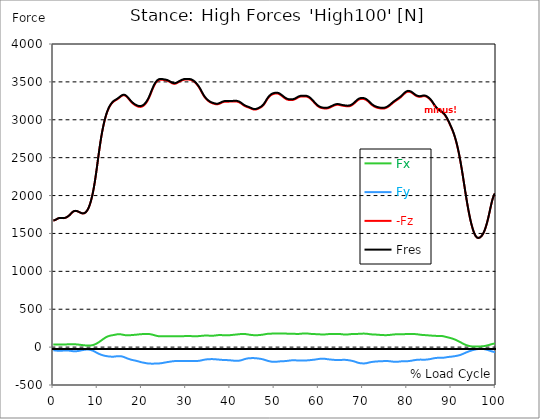
| Category |  Fx |  Fy |  -Fz |  Fres |
|---|---|---|---|---|
| 0.0 | 35.362 | -42.18 | 1669.682 | 1670.712 |
| 0.167348456675344 | 35.411 | -42.719 | 1672.134 | 1673.181 |
| 0.334696913350688 | 35.477 | -43.455 | 1675.469 | 1676.516 |
| 0.5020453700260321 | 35.591 | -44.403 | 1679.769 | 1680.848 |
| 0.669393826701376 | 35.722 | -45.515 | 1684.952 | 1686.063 |
| 0.83674228337672 | 35.853 | -46.692 | 1690.805 | 1691.949 |
| 1.0040907400520642 | 35.967 | -47.689 | 1696.118 | 1697.295 |
| 1.1621420602454444 | 36.033 | -48.294 | 1699.96 | 1701.153 |
| 1.3294905169207885 | 36.065 | -48.523 | 1702.412 | 1703.622 |
| 1.4968389735961325 | 36.033 | -48.441 | 1703.655 | 1704.848 |
| 1.6641874302714765 | 35.967 | -48.098 | 1703.916 | 1705.093 |
| 1.8315358869468206 | 35.853 | -47.575 | 1703.475 | 1704.636 |
| 1.9988843436221646 | 35.706 | -46.905 | 1702.641 | 1703.785 |
| 2.1662328002975086 | 35.575 | -46.185 | 1701.971 | 1703.099 |
| 2.333581256972853 | 35.493 | -45.482 | 1701.987 | 1703.115 |
| 2.5009297136481967 | 35.509 | -44.845 | 1703.017 | 1704.129 |
| 2.6682781703235405 | 35.608 | -44.321 | 1705.224 | 1706.32 |
| 2.8356266269988843 | 35.771 | -44.011 | 1708.674 | 1709.769 |
| 3.002975083674229 | 36.033 | -43.994 | 1713.284 | 1714.379 |
| 3.1703235403495724 | 36.376 | -44.354 | 1718.957 | 1720.085 |
| 3.337671997024917 | 36.752 | -45.024 | 1725.595 | 1726.723 |
| 3.4957233172182973 | 37.128 | -45.956 | 1733.181 | 1734.341 |
| 3.663071773893641 | 37.488 | -47.133 | 1741.78 | 1742.973 |
| 3.8304202305689854 | 37.847 | -48.507 | 1751.458 | 1752.685 |
| 3.997768687244329 | 38.223 | -50.044 | 1762.052 | 1763.328 |
| 4.165117143919673 | 38.469 | -51.564 | 1772.45 | 1773.774 |
| 4.332465600595017 | 38.518 | -52.872 | 1781.589 | 1782.946 |
| 4.499814057270361 | 38.371 | -53.853 | 1788.635 | 1790.009 |
| 4.667162513945706 | 38.027 | -54.441 | 1793.475 | 1794.864 |
| 4.834510970621049 | 37.504 | -54.67 | 1796.221 | 1797.611 |
| 5.001859427296393 | 36.817 | -54.523 | 1797.055 | 1798.428 |
| 5.169207883971737 | 36.016 | -54 | 1796.205 | 1797.529 |
| 5.336556340647081 | 35.084 | -53.15 | 1793.949 | 1795.24 |
| 5.503904797322425 | 34.104 | -51.973 | 1790.581 | 1791.823 |
| 5.671253253997769 | 33.074 | -50.501 | 1786.396 | 1787.589 |
| 5.82930457419115 | 31.995 | -48.768 | 1781.72 | 1782.848 |
| 5.996653030866494 | 30.866 | -46.856 | 1776.832 | 1777.894 |
| 6.164001487541838 | 29.673 | -44.861 | 1772.042 | 1773.039 |
| 6.331349944217181 | 28.43 | -42.817 | 1767.922 | 1768.853 |
| 6.498698400892526 | 27.204 | -40.79 | 1764.995 | 1765.862 |
| 6.66604685756787 | 25.978 | -38.845 | 1763.753 | 1764.554 |
| 6.833395314243213 | 24.801 | -36.997 | 1764.358 | 1765.11 |
| 7.000743770918558 | 23.689 | -35.313 | 1767.022 | 1767.725 |
| 7.168092227593902 | 22.708 | -33.924 | 1772.156 | 1772.826 |
| 7.335440684269246 | 21.858 | -32.861 | 1779.987 | 1780.625 |
| 7.50278914094459 | 21.172 | -32.191 | 1790.728 | 1791.349 |
| 7.6701375976199335 | 20.714 | -31.962 | 1804.69 | 1805.295 |
| 7.837486054295278 | 20.452 | -32.207 | 1822.036 | 1822.657 |
| 7.995537374488658 | 20.452 | -32.959 | 1842.93 | 1843.567 |
| 8.162885831164003 | 20.698 | -34.218 | 1867.584 | 1868.254 |
| 8.330234287839346 | 21.286 | -36.098 | 1896.406 | 1897.126 |
| 8.49758274451469 | 22.234 | -38.599 | 1929.643 | 1930.428 |
| 8.664931201190035 | 23.64 | -41.657 | 1967.425 | 1968.276 |
| 8.832279657865378 | 25.553 | -45.253 | 2009.85 | 2010.815 |
| 8.999628114540721 | 28.022 | -49.324 | 2056.984 | 2058.079 |
| 9.166976571216066 | 31.079 | -53.853 | 2109.038 | 2110.281 |
| 9.334325027891412 | 34.741 | -58.806 | 2166.39 | 2167.796 |
| 9.501673484566755 | 38.992 | -64.103 | 2228.891 | 2230.51 |
| 9.669021941242098 | 43.733 | -69.548 | 2295.741 | 2297.572 |
| 9.836370397917442 | 48.948 | -74.975 | 2365.747 | 2367.79 |
| 10.003718854592787 | 54.556 | -80.191 | 2437.436 | 2439.725 |
| 10.17106731126813 | 60.507 | -85.095 | 2509.223 | 2511.741 |
| 10.329118631461512 | 66.817 | -89.657 | 2579.866 | 2582.645 |
| 10.496467088136853 | 73.455 | -93.875 | 2648.04 | 2651.065 |
| 10.663815544812199 | 80.289 | -97.733 | 2712.389 | 2715.675 |
| 10.831164001487544 | 87.351 | -101.297 | 2772.52 | 2776.068 |
| 10.998512458162887 | 94.512 | -104.632 | 2828.089 | 2831.915 |
| 11.16586091483823 | 101.706 | -107.689 | 2879.048 | 2883.168 |
| 11.333209371513574 | 108.801 | -110.452 | 2925.642 | 2930.04 |
| 11.50055782818892 | 115.618 | -112.872 | 2968.116 | 2972.792 |
| 11.667906284864264 | 122.076 | -114.997 | 3006.732 | 3011.669 |
| 11.835254741539607 | 127.978 | -116.894 | 3041.866 | 3047.081 |
| 12.00260319821495 | 133.226 | -118.627 | 3073.55 | 3078.994 |
| 12.169951654890292 | 137.869 | -120.229 | 3101.866 | 3107.506 |
| 12.337300111565641 | 141.94 | -121.716 | 3126.928 | 3132.781 |
| 12.504648568240984 | 145.488 | -123.057 | 3148.999 | 3155.048 |
| 12.662699888434362 | 148.577 | -124.169 | 3168.405 | 3174.601 |
| 12.830048345109708 | 151.144 | -124.954 | 3185.457 | 3191.8 |
| 12.997396801785053 | 153.253 | -125.509 | 3200.498 | 3206.955 |
| 13.164745258460396 | 155.101 | -126 | 3213.658 | 3220.214 |
| 13.33209371513574 | 156.752 | -126.245 | 3225.021 | 3231.658 |
| 13.499442171811083 | 158.321 | -126.18 | 3234.716 | 3241.419 |
| 13.666790628486426 | 159.989 | -125.706 | 3242.841 | 3249.609 |
| 13.834139085161771 | 161.885 | -124.79 | 3249.626 | 3256.443 |
| 14.001487541837117 | 164.027 | -123.515 | 3255.348 | 3262.23 |
| 14.16883599851246 | 166.234 | -122.043 | 3260.579 | 3267.495 |
| 14.336184455187803 | 168 | -120.687 | 3266.252 | 3273.2 |
| 14.503532911863147 | 169.128 | -119.64 | 3272.743 | 3279.691 |
| 14.670881368538492 | 169.618 | -119.003 | 3279.953 | 3286.868 |
| 14.828932688731873 | 169.667 | -118.888 | 3287.571 | 3294.438 |
| 14.996281145407215 | 169.488 | -119.215 | 3295.271 | 3302.121 |
| 15.163629602082558 | 169.013 | -119.853 | 3303.004 | 3309.838 |
| 15.330978058757903 | 167.853 | -120.964 | 3310.541 | 3317.326 |
| 15.498326515433247 | 166.152 | -122.828 | 3316.999 | 3323.767 |
| 15.665674972108594 | 164.109 | -125.411 | 3321.675 | 3328.443 |
| 15.833023428783937 | 161.934 | -128.583 | 3324.029 | 3330.846 |
| 16.00037188545928 | 159.94 | -132.18 | 3323.914 | 3330.781 |
| 16.167720342134626 | 158.24 | -136.103 | 3321.348 | 3328.312 |
| 16.335068798809967 | 156.981 | -140.174 | 3316.427 | 3323.538 |
| 16.502417255485312 | 156.147 | -144.229 | 3309.38 | 3316.655 |
| 16.669765712160658 | 155.755 | -148.103 | 3300.388 | 3307.844 |
| 16.837114168836 | 155.771 | -151.749 | 3289.647 | 3297.299 |
| 17.004462625511344 | 156.098 | -155.215 | 3277.713 | 3285.577 |
| 17.16251394570472 | 156.605 | -158.55 | 3265.435 | 3273.527 |
| 17.32986240238007 | 157.193 | -161.738 | 3253.517 | 3261.838 |
| 17.497210859055414 | 157.88 | -164.714 | 3242.138 | 3250.672 |
| 17.664559315730756 | 158.681 | -167.379 | 3231.56 | 3240.29 |
| 17.8319077724061 | 159.547 | -169.716 | 3221.98 | 3230.923 |
| 17.999256229081443 | 160.381 | -171.727 | 3213.446 | 3222.552 |
| 18.166604685756788 | 161.117 | -173.591 | 3205.811 | 3215.081 |
| 18.333953142432133 | 161.836 | -175.52 | 3198.895 | 3208.312 |
| 18.501301599107478 | 162.686 | -177.597 | 3192.552 | 3202.132 |
| 18.668650055782823 | 163.651 | -179.885 | 3186.716 | 3196.508 |
| 18.835998512458165 | 164.697 | -182.256 | 3181.5 | 3191.489 |
| 19.00334696913351 | 165.776 | -184.708 | 3177.004 | 3187.19 |
| 19.170695425808855 | 166.855 | -187.357 | 3173.424 | 3183.838 |
| 19.338043882484197 | 167.918 | -190.169 | 3170.939 | 3181.566 |
| 19.496095202677576 | 168.866 | -193.128 | 3169.68 | 3180.536 |
| 19.66344365935292 | 169.667 | -196.087 | 3169.664 | 3180.732 |
| 19.830792116028263 | 170.436 | -198.801 | 3170.939 | 3182.203 |
| 19.998140572703612 | 171.204 | -201.041 | 3173.669 | 3185.097 |
| 20.165489029378953 | 171.874 | -202.888 | 3177.822 | 3189.364 |
| 20.3328374860543 | 172.479 | -204.621 | 3183.511 | 3195.184 |
| 20.500185942729644 | 173.019 | -206.419 | 3190.983 | 3202.754 |
| 20.667534399404985 | 173.477 | -208.349 | 3200.285 | 3212.171 |
| 20.83488285608033 | 173.934 | -210.376 | 3211.37 | 3223.369 |
| 21.002231312755672 | 174.359 | -212.387 | 3224.187 | 3236.285 |
| 21.16957976943102 | 174.523 | -214.087 | 3238.852 | 3250.999 |
| 21.336928226106362 | 174.261 | -215.362 | 3255.626 | 3267.773 |
| 21.504276682781704 | 173.558 | -216.261 | 3274.525 | 3286.639 |
| 21.67162513945705 | 172.512 | -216.981 | 3295.435 | 3307.451 |
| 21.82967645965043 | 171.188 | -217.537 | 3318.111 | 3330.012 |
| 21.997024916325774 | 169.537 | -217.913 | 3342.061 | 3353.816 |
| 22.16437337300112 | 167.607 | -218.125 | 3366.699 | 3378.323 |
| 22.33172182967646 | 165.368 | -218.207 | 3391.239 | 3402.683 |
| 22.499070286351806 | 162.752 | -218.141 | 3414.748 | 3425.996 |
| 22.666418743027148 | 159.94 | -217.994 | 3436.606 | 3447.658 |
| 22.833767199702496 | 157.046 | -217.831 | 3456.388 | 3467.228 |
| 23.00111565637784 | 154.169 | -217.7 | 3473.849 | 3484.492 |
| 23.168464113053183 | 151.34 | -217.586 | 3488.873 | 3499.336 |
| 23.335812569728528 | 148.855 | -217.406 | 3501.429 | 3511.729 |
| 23.50316102640387 | 146.779 | -217.095 | 3511.484 | 3521.636 |
| 23.670509483079215 | 145.161 | -216.572 | 3519.102 | 3529.124 |
| 23.83785793975456 | 144.016 | -215.804 | 3524.497 | 3534.405 |
| 23.995909259947936 | 143.199 | -214.872 | 3527.93 | 3537.723 |
| 24.163257716623285 | 142.708 | -213.793 | 3529.631 | 3539.326 |
| 24.330606173298627 | 142.43 | -212.599 | 3529.99 | 3539.603 |
| 24.49795462997397 | 142.283 | -211.259 | 3529.369 | 3538.884 |
| 24.665303086649313 | 142.218 | -209.705 | 3527.947 | 3537.364 |
| 24.83265154332466 | 142.136 | -208.005 | 3526.148 | 3535.467 |
| 25.0 | 141.989 | -206.109 | 3524.383 | 3533.587 |
| 25.167348456675345 | 141.842 | -204.163 | 3522.797 | 3531.87 |
| 25.334696913350694 | 141.809 | -202.25 | 3521.554 | 3530.53 |
| 25.502045370026035 | 141.858 | -200.387 | 3520.116 | 3528.977 |
| 25.669393826701377 | 141.94 | -198.67 | 3517.663 | 3526.426 |
| 25.836742283376722 | 141.973 | -197.117 | 3514.001 | 3522.682 |
| 26.004090740052067 | 141.989 | -195.646 | 3509.571 | 3518.187 |
| 26.17143919672741 | 142.152 | -194.223 | 3504.584 | 3513.135 |
| 26.329490516920792 | 142.496 | -192.752 | 3498.993 | 3507.494 |
| 26.49683897359613 | 142.872 | -191.248 | 3493.157 | 3501.593 |
| 26.66418743027148 | 143.166 | -189.613 | 3487.386 | 3495.756 |
| 26.831535886946828 | 143.33 | -188.027 | 3482.203 | 3490.508 |
| 26.998884343622166 | 143.28 | -186.686 | 3478.247 | 3486.486 |
| 27.166232800297514 | 143.117 | -185.656 | 3475.696 | 3483.871 |
| 27.333581256972852 | 142.921 | -184.937 | 3474.715 | 3482.841 |
| 27.5009297136482 | 142.839 | -184.447 | 3475.336 | 3483.413 |
| 27.668278170323543 | 142.937 | -184.136 | 3477.593 | 3485.653 |
| 27.835626626998888 | 143.084 | -183.907 | 3481.287 | 3489.315 |
| 28.002975083674233 | 143.231 | -183.678 | 3486.241 | 3494.236 |
| 28.170323540349575 | 143.379 | -183.384 | 3491.98 | 3499.941 |
| 28.33767199702492 | 143.526 | -182.992 | 3498.012 | 3505.925 |
| 28.50502045370026 | 143.591 | -182.665 | 3503.587 | 3511.484 |
| 28.663071773893645 | 143.558 | -182.501 | 3508.426 | 3516.29 |
| 28.830420230568986 | 143.607 | -182.501 | 3512.906 | 3520.753 |
| 28.99776868724433 | 143.689 | -182.746 | 3517.435 | 3525.298 |
| 29.165117143919673 | 143.82 | -183.27 | 3521.898 | 3529.778 |
| 29.33246560059502 | 144.065 | -183.825 | 3525.723 | 3533.636 |
| 29.499814057270367 | 144.474 | -184.25 | 3528.421 | 3536.383 |
| 29.66716251394571 | 145.193 | -184.545 | 3530.105 | 3538.099 |
| 29.834510970621054 | 146.092 | -184.594 | 3530.857 | 3538.917 |
| 30.00185942729639 | 146.975 | -184.545 | 3530.988 | 3539.097 |
| 30.169207883971744 | 147.727 | -184.528 | 3530.726 | 3538.884 |
| 30.33655634064708 | 148.169 | -184.561 | 3530.366 | 3538.541 |
| 30.50390479732243 | 148.136 | -184.626 | 3530.138 | 3538.312 |
| 30.671253253997772 | 147.646 | -184.659 | 3529.99 | 3538.148 |
| 30.829304574191156 | 146.763 | -184.659 | 3529.598 | 3537.707 |
| 30.996653030866494 | 145.88 | -184.676 | 3528.192 | 3536.236 |
| 31.164001487541842 | 145.095 | -184.692 | 3525.445 | 3533.473 |
| 31.331349944217187 | 144.441 | -184.708 | 3521.44 | 3529.451 |
| 31.498698400892525 | 143.869 | -184.676 | 3516.274 | 3524.252 |
| 31.666046857567874 | 143.444 | -184.61 | 3509.996 | 3517.941 |
| 31.833395314243212 | 143.182 | -184.463 | 3502.623 | 3510.568 |
| 32.00074377091856 | 143.133 | -184.218 | 3494.17 | 3502.116 |
| 32.1680922275939 | 143.264 | -183.874 | 3484.672 | 3492.617 |
| 32.33544068426925 | 143.558 | -183.449 | 3474.192 | 3482.154 |
| 32.50278914094459 | 143.967 | -182.943 | 3462.797 | 3470.742 |
| 32.670137597619934 | 144.458 | -182.289 | 3450.405 | 3458.366 |
| 32.83748605429528 | 145.095 | -181.389 | 3436.786 | 3444.748 |
| 33.004834510970625 | 145.864 | -180.163 | 3421.68 | 3429.642 |
| 33.162885831164004 | 146.746 | -178.61 | 3405.2 | 3413.162 |
| 33.33023428783935 | 147.711 | -176.763 | 3387.511 | 3395.44 |
| 33.497582744514695 | 148.708 | -174.686 | 3368.906 | 3376.819 |
| 33.664931201190036 | 149.689 | -172.398 | 3350.399 | 3358.279 |
| 33.83227965786538 | 150.605 | -170.027 | 3332.873 | 3340.721 |
| 33.99962811454073 | 151.389 | -167.706 | 3316.655 | 3324.454 |
| 34.16697657121607 | 151.994 | -165.629 | 3302.007 | 3309.756 |
| 34.33432502789141 | 152.37 | -163.945 | 3289.01 | 3296.726 |
| 34.50167348456676 | 152.468 | -162.768 | 3277.615 | 3285.299 |
| 34.6690219412421 | 152.354 | -161.771 | 3267.331 | 3274.999 |
| 34.83637039791744 | 152.125 | -160.872 | 3257.963 | 3265.598 |
| 35.00371885459279 | 151.798 | -160.103 | 3249.544 | 3257.162 |
| 35.17106731126814 | 151.455 | -159.482 | 3242.023 | 3249.609 |
| 35.338415767943474 | 151.21 | -159.041 | 3235.369 | 3242.939 |
| 35.49646708813686 | 151.046 | -158.714 | 3229.664 | 3237.233 |
| 35.6638155448122 | 150.915 | -158.452 | 3224.841 | 3232.394 |
| 35.831164001487544 | 150.785 | -158.321 | 3220.786 | 3228.34 |
| 35.998512458162885 | 150.752 | -158.436 | 3217.304 | 3224.874 |
| 36.165860914838234 | 150.997 | -158.844 | 3214.034 | 3221.637 |
| 36.333209371513576 | 151.586 | -159.368 | 3210.863 | 3218.53 |
| 36.50055782818892 | 152.518 | -160.005 | 3207.936 | 3215.702 |
| 36.667906284864266 | 153.76 | -160.823 | 3205.582 | 3213.446 |
| 36.83525474153961 | 155.133 | -161.755 | 3204.045 | 3212.04 |
| 37.002603198214956 | 156.441 | -162.67 | 3203.718 | 3211.811 |
| 37.1699516548903 | 157.569 | -163.553 | 3204.732 | 3212.939 |
| 37.337300111565646 | 158.387 | -164.436 | 3207.102 | 3215.391 |
| 37.50464856824098 | 158.894 | -165.302 | 3210.617 | 3218.972 |
| 37.66269988843437 | 159.041 | -166.185 | 3214.934 | 3223.337 |
| 37.83004834510971 | 158.91 | -167.068 | 3219.675 | 3228.094 |
| 37.99739680178505 | 158.583 | -167.918 | 3224.449 | 3232.868 |
| 38.16474525846039 | 158.125 | -168.637 | 3228.846 | 3237.282 |
| 38.33209371513574 | 157.635 | -169.308 | 3232.77 | 3241.19 |
| 38.49944217181109 | 157.161 | -169.88 | 3235.893 | 3244.312 |
| 38.666790628486424 | 156.768 | -170.403 | 3238.018 | 3246.438 |
| 38.83413908516178 | 156.458 | -170.812 | 3239.13 | 3247.549 |
| 39.001487541837115 | 156.245 | -171.106 | 3239.326 | 3247.745 |
| 39.16883599851246 | 156.131 | -171.384 | 3239.015 | 3247.435 |
| 39.336184455187805 | 156.163 | -171.727 | 3238.786 | 3247.239 |
| 39.503532911863154 | 156.327 | -172.185 | 3238.868 | 3247.337 |
| 39.670881368538495 | 156.686 | -172.757 | 3239.162 | 3247.68 |
| 39.83822982521384 | 157.259 | -173.46 | 3239.604 | 3248.187 |
| 39.996281145407224 | 158.043 | -174.31 | 3239.98 | 3248.645 |
| 40.163629602082565 | 159.041 | -175.275 | 3240.127 | 3248.906 |
| 40.33097805875791 | 160.12 | -176.321 | 3240.143 | 3249.037 |
| 40.498326515433256 | 161.182 | -177.319 | 3240.143 | 3249.151 |
| 40.6656749721086 | 162.196 | -178.218 | 3240.307 | 3249.446 |
| 40.83302342878393 | 163.144 | -179.035 | 3240.765 | 3249.985 |
| 41.00037188545929 | 164.027 | -179.738 | 3241.337 | 3250.639 |
| 41.16772034213463 | 164.926 | -180.343 | 3241.647 | 3251.032 |
| 41.33506879880997 | 165.907 | -180.719 | 3241.271 | 3250.737 |
| 41.50241725548531 | 166.953 | -180.817 | 3240.029 | 3249.56 |
| 41.66976571216066 | 168.049 | -180.556 | 3237.838 | 3247.419 |
| 41.837114168836 | 169.128 | -179.885 | 3234.716 | 3244.312 |
| 42.004462625511344 | 170.174 | -178.757 | 3230.628 | 3240.241 |
| 42.17181108218669 | 171.155 | -177.171 | 3225.626 | 3235.222 |
| 42.32986240238007 | 172.103 | -175.193 | 3219.773 | 3229.337 |
| 42.497210859055414 | 172.937 | -172.757 | 3213.053 | 3222.568 |
| 42.66455931573076 | 173.542 | -169.913 | 3205.746 | 3215.162 |
| 42.831907772406105 | 173.885 | -166.79 | 3198.356 | 3207.658 |
| 42.999256229081446 | 173.918 | -163.504 | 3191.473 | 3200.628 |
| 43.16660468575679 | 173.591 | -160.234 | 3185.342 | 3194.35 |
| 43.33395314243214 | 172.872 | -157.161 | 3180.013 | 3188.841 |
| 43.50130159910748 | 171.727 | -154.365 | 3175.517 | 3184.149 |
| 43.66865005578282 | 170.24 | -151.962 | 3171.609 | 3180.062 |
| 43.83599851245817 | 168.605 | -149.967 | 3168.094 | 3176.367 |
| 44.00334696913351 | 166.953 | -148.512 | 3164.841 | 3172.95 |
| 44.17069542580886 | 165.351 | -147.433 | 3161.538 | 3169.5 |
| 44.3380438824842 | 163.831 | -146.648 | 3157.893 | 3165.724 |
| 44.49609520267758 | 162.409 | -146.043 | 3153.789 | 3161.506 |
| 44.66344365935292 | 161.052 | -145.569 | 3149.261 | 3156.912 |
| 44.83079211602827 | 159.891 | -145.193 | 3144.634 | 3152.187 |
| 44.99814057270361 | 158.926 | -144.932 | 3140.432 | 3147.92 |
| 45.16548902937895 | 158.174 | -144.915 | 3137.228 | 3144.683 |
| 45.332837486054295 | 157.618 | -145.128 | 3135.184 | 3142.639 |
| 45.500185942729644 | 157.291 | -145.602 | 3134.4 | 3141.838 |
| 45.66753439940499 | 157.144 | -146.305 | 3134.743 | 3142.198 |
| 45.83488285608033 | 157.21 | -147.171 | 3136.214 | 3143.718 |
| 46.00223131275568 | 157.422 | -148.185 | 3138.716 | 3146.285 |
| 46.16957976943102 | 157.749 | -149.313 | 3142.231 | 3149.849 |
| 46.336928226106366 | 158.223 | -150.49 | 3146.579 | 3154.263 |
| 46.50427668278171 | 158.91 | -151.733 | 3151.353 | 3159.135 |
| 46.671625139457056 | 159.793 | -153.073 | 3156.356 | 3164.22 |
| 46.829676459650436 | 160.855 | -154.594 | 3161.62 | 3169.582 |
| 46.99702491632577 | 161.934 | -156.327 | 3167.489 | 3175.582 |
| 47.16437337300112 | 163.128 | -158.321 | 3174.405 | 3182.661 |
| 47.33172182967646 | 164.501 | -160.61 | 3182.955 | 3191.359 |
| 47.49907028635181 | 165.989 | -163.161 | 3193.419 | 3202.018 |
| 47.66641874302716 | 167.607 | -165.989 | 3205.974 | 3214.77 |
| 47.83376719970249 | 169.357 | -169.21 | 3220.705 | 3229.713 |
| 48.001115656377834 | 171.237 | -172.594 | 3236.972 | 3246.225 |
| 48.16846411305319 | 172.986 | -175.798 | 3253.402 | 3262.868 |
| 48.33581256972853 | 174.425 | -178.725 | 3268.819 | 3278.497 |
| 48.50316102640387 | 175.52 | -181.455 | 3282.879 | 3292.721 |
| 48.67050948307921 | 176.272 | -184.005 | 3295.369 | 3305.358 |
| 48.837857939754564 | 176.746 | -186.278 | 3306.307 | 3316.427 |
| 49.005206396429905 | 177.139 | -188.37 | 3315.675 | 3325.909 |
| 49.163257716623285 | 177.515 | -190.25 | 3323.457 | 3333.822 |
| 49.33060617329863 | 177.907 | -191.853 | 3329.833 | 3340.296 |
| 49.49795462997397 | 178.283 | -193.111 | 3334.95 | 3345.495 |
| 49.66530308664932 | 178.643 | -193.978 | 3338.955 | 3349.566 |
| 49.832651543324666 | 178.953 | -194.436 | 3341.996 | 3352.672 |
| 50.0 | 179.166 | -194.517 | 3344.269 | 3354.944 |
| 50.16734845667534 | 179.199 | -194.191 | 3345.871 | 3356.546 |
| 50.33469691335069 | 179.019 | -193.537 | 3346.852 | 3357.478 |
| 50.50204537002604 | 178.659 | -192.605 | 3347.146 | 3357.707 |
| 50.66939382670139 | 178.283 | -191.542 | 3346.443 | 3356.922 |
| 50.836742283376715 | 178.071 | -190.463 | 3344.269 | 3354.683 |
| 51.00409074005207 | 178.022 | -189.433 | 3340.574 | 3350.939 |
| 51.17143919672741 | 178.103 | -188.485 | 3335.326 | 3345.658 |
| 51.32949051692079 | 178.234 | -187.684 | 3328.95 | 3339.266 |
| 51.496838973596134 | 178.398 | -187.128 | 3322.116 | 3332.432 |
| 51.66418743027148 | 178.61 | -186.703 | 3314.873 | 3325.19 |
| 51.831535886946824 | 178.741 | -186.261 | 3307.255 | 3317.571 |
| 51.99888434362217 | 178.774 | -185.804 | 3299.424 | 3309.756 |
| 52.16623280029752 | 178.659 | -185.313 | 3291.642 | 3301.958 |
| 52.33358125697285 | 178.528 | -184.79 | 3284.301 | 3294.601 |
| 52.5009297136482 | 178.398 | -184.169 | 3277.762 | 3288.029 |
| 52.668278170323546 | 178.169 | -183.335 | 3272.236 | 3282.454 |
| 52.835626626998895 | 177.711 | -182.174 | 3267.985 | 3278.138 |
| 53.00297508367424 | 177.155 | -180.883 | 3264.683 | 3274.754 |
| 53.17032354034958 | 176.534 | -179.526 | 3262.181 | 3272.154 |
| 53.33767199702492 | 175.913 | -178.136 | 3260.579 | 3270.454 |
| 53.50502045370027 | 175.471 | -176.779 | 3259.696 | 3269.473 |
| 53.663071773893655 | 175.242 | -175.569 | 3259.353 | 3269.064 |
| 53.83042023056899 | 175.226 | -174.637 | 3259.549 | 3269.211 |
| 53.99776868724433 | 175.291 | -174.098 | 3260.383 | 3270.012 |
| 54.16511714391967 | 175.308 | -173.983 | 3261.969 | 3271.582 |
| 54.33246560059503 | 175.21 | -174.114 | 3264.389 | 3273.985 |
| 54.49981405727037 | 174.981 | -174.343 | 3267.74 | 3277.337 |
| 54.667162513945705 | 174.735 | -174.67 | 3272.007 | 3281.587 |
| 54.834510970621054 | 174.441 | -174.964 | 3277.141 | 3286.705 |
| 55.0018594272964 | 174.18 | -175.161 | 3282.993 | 3292.541 |
| 55.169207883971744 | 174.016 | -175.291 | 3289.157 | 3298.688 |
| 55.336556340647086 | 174 | -175.389 | 3294.814 | 3304.312 |
| 55.50390479732243 | 174.212 | -175.586 | 3299.44 | 3308.955 |
| 55.671253253997776 | 174.768 | -175.913 | 3303.004 | 3312.568 |
| 55.83860171067312 | 175.569 | -176.354 | 3305.538 | 3315.168 |
| 55.9966530308665 | 176.697 | -176.943 | 3307.19 | 3316.917 |
| 56.16400148754184 | 177.94 | -177.466 | 3308.17 | 3317.996 |
| 56.33134994421718 | 179.052 | -177.711 | 3308.612 | 3318.519 |
| 56.498698400892536 | 179.951 | -177.744 | 3308.71 | 3318.683 |
| 56.66604685756788 | 180.523 | -177.58 | 3308.775 | 3318.764 |
| 56.83339531424321 | 180.719 | -177.253 | 3308.596 | 3318.585 |
| 57.00074377091856 | 180.637 | -176.795 | 3307.991 | 3317.963 |
| 57.16809222759391 | 180.343 | -176.207 | 3306.781 | 3316.705 |
| 57.33544068426925 | 179.787 | -175.488 | 3304.606 | 3314.481 |
| 57.5027891409446 | 178.986 | -174.654 | 3301.255 | 3311.032 |
| 57.670137597619934 | 178.022 | -173.771 | 3296.628 | 3306.339 |
| 57.83748605429528 | 176.975 | -172.921 | 3290.89 | 3300.503 |
| 58.004834510970625 | 175.896 | -172.054 | 3284.138 | 3293.669 |
| 58.16288583116401 | 174.866 | -171.041 | 3276.421 | 3285.871 |
| 58.330234287839346 | 173.918 | -169.962 | 3267.789 | 3277.141 |
| 58.497582744514695 | 173.117 | -168.899 | 3258.192 | 3267.478 |
| 58.66493120119004 | 172.447 | -167.885 | 3247.68 | 3256.901 |
| 58.832279657865385 | 172.022 | -166.921 | 3236.498 | 3245.686 |
| 58.999628114540734 | 171.76 | -165.809 | 3225.38 | 3234.519 |
| 59.16697657121607 | 171.498 | -164.452 | 3214.574 | 3223.664 |
| 59.33432502789142 | 171.237 | -162.932 | 3204.209 | 3213.233 |
| 59.50167348456676 | 170.926 | -161.33 | 3194.579 | 3203.538 |
| 59.66902194124211 | 170.468 | -159.695 | 3185.947 | 3194.825 |
| 59.83637039791745 | 169.929 | -158.092 | 3178.345 | 3187.124 |
| 60.00371885459278 | 169.34 | -156.588 | 3171.773 | 3180.454 |
| 60.17106731126813 | 168.703 | -155.215 | 3166.165 | 3174.765 |
| 60.33841576794349 | 168.065 | -154.005 | 3161.489 | 3170.007 |
| 60.49646708813685 | 167.477 | -153.041 | 3157.795 | 3166.263 |
| 60.6638155448122 | 166.986 | -152.403 | 3155.113 | 3163.517 |
| 60.831164001487544 | 166.61 | -152.191 | 3153.266 | 3161.653 |
| 60.99851245816289 | 166.447 | -152.37 | 3151.795 | 3160.182 |
| 61.16586091483824 | 166.561 | -152.943 | 3150.372 | 3158.808 |
| 61.333209371513576 | 167.035 | -153.874 | 3149.195 | 3157.697 |
| 61.50055782818892 | 167.836 | -155.15 | 3148.459 | 3157.075 |
| 61.667906284864266 | 168.883 | -156.654 | 3148.394 | 3157.157 |
| 61.835254741539615 | 169.962 | -158.191 | 3149.179 | 3158.089 |
| 62.002603198214956 | 170.877 | -159.629 | 3150.977 | 3160.002 |
| 62.16995165489029 | 171.531 | -160.823 | 3153.724 | 3162.846 |
| 62.33730011156564 | 171.94 | -161.836 | 3157.206 | 3166.394 |
| 62.504648568240995 | 172.136 | -162.817 | 3161.212 | 3170.432 |
| 62.67199702491633 | 172.152 | -163.847 | 3165.528 | 3174.814 |
| 62.83004834510971 | 172.005 | -164.894 | 3170.073 | 3179.375 |
| 62.99739680178505 | 171.76 | -165.874 | 3174.797 | 3184.132 |
| 63.1647452584604 | 171.564 | -166.839 | 3179.555 | 3188.906 |
| 63.33209371513575 | 171.466 | -167.738 | 3184.231 | 3193.598 |
| 63.4994421718111 | 171.547 | -168.523 | 3188.612 | 3197.996 |
| 63.666790628486424 | 171.825 | -169.144 | 3192.47 | 3201.904 |
| 63.83413908516177 | 172.169 | -169.651 | 3195.446 | 3204.895 |
| 64.00148754183712 | 172.463 | -170.06 | 3197.326 | 3206.808 |
| 64.16883599851248 | 172.692 | -170.403 | 3198.127 | 3207.626 |
| 64.3361844551878 | 172.855 | -170.648 | 3197.947 | 3207.462 |
| 64.50353291186315 | 172.872 | -170.763 | 3196.917 | 3206.449 |
| 64.6708813685385 | 172.659 | -170.616 | 3195.168 | 3204.683 |
| 64.83822982521384 | 172.201 | -170.24 | 3192.961 | 3202.427 |
| 65.00557828188919 | 171.449 | -169.651 | 3190.607 | 3200.007 |
| 65.16362960208257 | 170.452 | -168.997 | 3188.4 | 3197.718 |
| 65.3309780587579 | 169.275 | -168.343 | 3186.372 | 3195.609 |
| 65.49832651543326 | 167.983 | -167.82 | 3184.672 | 3193.811 |
| 65.6656749721086 | 166.774 | -167.607 | 3183.233 | 3192.307 |
| 65.83302342878395 | 165.924 | -167.804 | 3181.893 | 3190.934 |
| 66.00037188545929 | 165.417 | -168.245 | 3180.585 | 3189.626 |
| 66.16772034213463 | 165.286 | -168.834 | 3179.293 | 3188.367 |
| 66.33506879880998 | 165.662 | -169.733 | 3178.1 | 3187.255 |
| 66.50241725548531 | 166.496 | -170.91 | 3177.152 | 3186.421 |
| 66.66976571216065 | 167.607 | -172.316 | 3176.841 | 3186.241 |
| 66.83711416883601 | 168.834 | -173.869 | 3177.609 | 3187.157 |
| 67.00446262551135 | 169.945 | -175.504 | 3179.735 | 3189.413 |
| 67.1718110821867 | 170.894 | -177.253 | 3183.168 | 3192.977 |
| 67.32986240238007 | 171.678 | -179.133 | 3187.68 | 3197.62 |
| 67.49721085905541 | 172.3 | -181.193 | 3193.108 | 3203.179 |
| 67.66455931573076 | 172.757 | -183.4 | 3199.37 | 3209.571 |
| 67.83190777240611 | 173.068 | -185.771 | 3206.53 | 3216.846 |
| 67.99925622908145 | 173.231 | -188.37 | 3214.59 | 3225.037 |
| 68.16660468575678 | 173.313 | -191.297 | 3223.517 | 3234.078 |
| 68.33395314243214 | 173.46 | -194.583 | 3232.672 | 3243.397 |
| 68.50130159910749 | 173.738 | -198.278 | 3241.958 | 3252.895 |
| 68.66865005578282 | 174.114 | -202.022 | 3250.852 | 3261.985 |
| 68.83599851245816 | 174.507 | -205.259 | 3258.438 | 3269.751 |
| 69.00334696913352 | 174.948 | -207.907 | 3264.519 | 3275.996 |
| 69.17069542580886 | 175.455 | -210.065 | 3269.228 | 3280.868 |
| 69.3380438824842 | 176.027 | -211.765 | 3272.743 | 3284.514 |
| 69.50539233915956 | 176.632 | -213.057 | 3275.081 | 3286.966 |
| 69.66344365935292 | 177.22 | -214.022 | 3276.274 | 3288.258 |
| 69.83079211602826 | 177.711 | -214.659 | 3276.372 | 3288.438 |
| 69.99814057270362 | 178.071 | -215.002 | 3275.506 | 3287.62 |
| 70.16548902937896 | 178.152 | -215.101 | 3273.969 | 3286.1 |
| 70.33283748605429 | 178.005 | -214.872 | 3271.533 | 3283.664 |
| 70.50018594272964 | 177.646 | -214.185 | 3267.953 | 3280.034 |
| 70.667534399405 | 177.008 | -213.008 | 3263.179 | 3275.179 |
| 70.83488285608033 | 176.141 | -211.357 | 3257.326 | 3269.195 |
| 71.00223131275568 | 175.03 | -209.297 | 3250.394 | 3262.116 |
| 71.16957976943102 | 173.771 | -206.91 | 3242.432 | 3253.974 |
| 71.33692822610637 | 172.381 | -204.278 | 3233.424 | 3244.754 |
| 71.50427668278171 | 171.041 | -201.76 | 3223.795 | 3234.961 |
| 71.67162513945706 | 169.798 | -199.553 | 3214.132 | 3225.135 |
| 71.8389735961324 | 168.67 | -197.673 | 3204.912 | 3215.767 |
| 71.99702491632577 | 167.738 | -196.054 | 3196.558 | 3207.315 |
| 72.16437337300113 | 167.003 | -194.599 | 3189.07 | 3199.713 |
| 72.33172182967647 | 166.496 | -193.389 | 3182.269 | 3192.846 |
| 72.49907028635181 | 166.103 | -192.343 | 3176.252 | 3186.765 |
| 72.66641874302715 | 165.76 | -191.379 | 3171.119 | 3181.582 |
| 72.8337671997025 | 165.368 | -190.528 | 3166.803 | 3177.201 |
| 73.00111565637783 | 164.91 | -189.744 | 3163.075 | 3173.408 |
| 73.16846411305319 | 164.354 | -189.041 | 3159.789 | 3170.073 |
| 73.33581256972853 | 163.684 | -188.387 | 3156.928 | 3167.146 |
| 73.50316102640387 | 162.899 | -187.782 | 3154.492 | 3164.645 |
| 73.67050948307921 | 162.016 | -187.291 | 3152.514 | 3162.601 |
| 73.83785793975457 | 161.084 | -186.85 | 3150.945 | 3160.966 |
| 74.00520639642991 | 160.218 | -186.392 | 3149.571 | 3159.544 |
| 74.16325771662328 | 159.58 | -185.967 | 3148.378 | 3158.285 |
| 74.33060617329863 | 159.09 | -185.542 | 3147.528 | 3157.386 |
| 74.49795462997398 | 158.714 | -185.15 | 3147.266 | 3157.092 |
| 74.66530308664932 | 158.37 | -184.757 | 3147.838 | 3157.615 |
| 74.83265154332466 | 158.06 | -184.381 | 3149.375 | 3159.119 |
| 75.00000000000001 | 157.88 | -184.054 | 3151.876 | 3161.588 |
| 75.16734845667534 | 157.88 | -183.809 | 3155.31 | 3164.988 |
| 75.3346969133507 | 158.027 | -183.727 | 3159.577 | 3169.239 |
| 75.50204537002605 | 158.354 | -183.923 | 3164.727 | 3174.421 |
| 75.66939382670138 | 158.861 | -184.381 | 3170.694 | 3180.421 |
| 75.83674228337672 | 159.564 | -185.068 | 3177.348 | 3187.141 |
| 76.00409074005208 | 160.479 | -186 | 3184.639 | 3194.53 |
| 76.17143919672742 | 161.575 | -187.128 | 3192.487 | 3202.476 |
| 76.33878765340276 | 162.736 | -188.387 | 3200.726 | 3210.83 |
| 76.49683897359614 | 163.929 | -189.662 | 3209.097 | 3219.315 |
| 76.66418743027148 | 165.122 | -190.937 | 3217.353 | 3227.702 |
| 76.83153588694682 | 166.234 | -192.131 | 3225.364 | 3235.811 |
| 76.99888434362218 | 167.231 | -193.177 | 3232.983 | 3243.544 |
| 77.16623280029752 | 168.016 | -193.929 | 3240.16 | 3250.803 |
| 77.33358125697285 | 168.49 | -194.321 | 3246.83 | 3257.522 |
| 77.5009297136482 | 168.752 | -194.305 | 3253.402 | 3264.111 |
| 77.66827817032356 | 168.834 | -193.864 | 3260.154 | 3270.83 |
| 77.83562662699889 | 168.915 | -193.079 | 3267.021 | 3277.647 |
| 78.00297508367423 | 169.079 | -192.131 | 3273.936 | 3284.497 |
| 78.17032354034959 | 169.242 | -190.97 | 3280.819 | 3291.299 |
| 78.33767199702493 | 169.438 | -189.76 | 3288.029 | 3298.427 |
| 78.50502045370027 | 169.684 | -188.665 | 3295.86 | 3306.176 |
| 78.67236891037561 | 169.978 | -187.929 | 3304.378 | 3314.628 |
| 78.83042023056899 | 170.338 | -187.537 | 3313.451 | 3323.669 |
| 78.99776868724433 | 170.746 | -187.455 | 3322.95 | 3333.151 |
| 79.16511714391969 | 171.057 | -187.635 | 3332.792 | 3342.993 |
| 79.33246560059503 | 171.204 | -187.831 | 3342.454 | 3352.639 |
| 79.49981405727036 | 171.335 | -187.847 | 3351.315 | 3361.467 |
| 79.66716251394571 | 171.564 | -187.537 | 3358.852 | 3368.971 |
| 79.83451097062107 | 171.874 | -186.997 | 3364.835 | 3374.922 |
| 80.00185942729641 | 172.25 | -186.261 | 3369.053 | 3379.108 |
| 80.16920788397174 | 172.643 | -185.395 | 3371.538 | 3381.544 |
| 80.33655634064709 | 173.035 | -184.398 | 3372.11 | 3382.067 |
| 80.50390479732243 | 173.411 | -183.27 | 3370.852 | 3380.759 |
| 80.67125325399778 | 173.755 | -181.978 | 3367.958 | 3377.816 |
| 80.83860171067312 | 174 | -180.539 | 3363.642 | 3373.435 |
| 80.99665303086651 | 174.049 | -178.921 | 3358.116 | 3367.843 |
| 81.16400148754184 | 173.918 | -177.204 | 3351.675 | 3361.304 |
| 81.3313499442172 | 173.591 | -175.389 | 3344.481 | 3354.012 |
| 81.49869840089255 | 173.019 | -173.526 | 3336.781 | 3346.214 |
| 81.66604685756786 | 172.332 | -171.76 | 3329.113 | 3338.432 |
| 81.83339531424322 | 171.564 | -170.24 | 3322.149 | 3331.353 |
| 82.00074377091858 | 170.697 | -168.948 | 3316.149 | 3325.255 |
| 82.16809222759392 | 169.716 | -167.869 | 3311.26 | 3320.252 |
| 82.33544068426926 | 168.621 | -166.953 | 3307.467 | 3316.361 |
| 82.50278914094459 | 167.379 | -166.201 | 3304.803 | 3313.582 |
| 82.67013759761994 | 166.054 | -165.58 | 3303.266 | 3311.947 |
| 82.83748605429528 | 164.681 | -165.139 | 3302.824 | 3311.391 |
| 83.00483451097062 | 163.324 | -164.959 | 3303.527 | 3311.996 |
| 83.17218296764597 | 162.082 | -165.057 | 3305.26 | 3313.664 |
| 83.33023428783935 | 161.052 | -165.335 | 3307.876 | 3316.214 |
| 83.4975827445147 | 160.25 | -165.678 | 3310.688 | 3318.993 |
| 83.66493120119004 | 159.646 | -165.924 | 3312.863 | 3321.151 |
| 83.83227965786537 | 159.09 | -166.005 | 3313.418 | 3321.675 |
| 83.99962811454073 | 158.518 | -165.891 | 3312.339 | 3320.563 |
| 84.16697657121607 | 157.896 | -165.498 | 3309.675 | 3317.865 |
| 84.33432502789142 | 157.242 | -164.779 | 3305.538 | 3313.68 |
| 84.50167348456677 | 156.49 | -163.782 | 3300.111 | 3308.17 |
| 84.6690219412421 | 155.64 | -162.556 | 3293.636 | 3301.631 |
| 84.83637039791745 | 154.708 | -161.15 | 3286.329 | 3294.225 |
| 85.0037188545928 | 153.76 | -159.646 | 3278.187 | 3285.985 |
| 85.17106731126813 | 152.91 | -157.994 | 3269.032 | 3276.748 |
| 85.33841576794349 | 152.191 | -156.18 | 3258.683 | 3266.301 |
| 85.50576422461883 | 151.586 | -154.169 | 3247.01 | 3254.547 |
| 85.66381554481221 | 151.112 | -152.027 | 3233.914 | 3241.369 |
| 85.83116400148755 | 150.736 | -149.82 | 3219.331 | 3226.721 |
| 85.99851245816289 | 150.327 | -147.711 | 3203.784 | 3211.124 |
| 86.16586091483823 | 149.722 | -145.945 | 3188.808 | 3196.1 |
| 86.33320937151358 | 149.003 | -144.474 | 3175.141 | 3182.367 |
| 86.50055782818893 | 148.234 | -143.264 | 3162.846 | 3170.04 |
| 86.66790628486427 | 147.466 | -142.316 | 3151.958 | 3159.119 |
| 86.83525474153961 | 146.812 | -141.678 | 3142.443 | 3149.588 |
| 87.00260319821496 | 146.419 | -141.4 | 3134.105 | 3141.233 |
| 87.16995165489031 | 146.289 | -141.368 | 3126.536 | 3133.697 |
| 87.33730011156564 | 146.338 | -141.515 | 3119.571 | 3126.765 |
| 87.504648568241 | 146.387 | -141.695 | 3113.032 | 3120.242 |
| 87.67199702491634 | 146.305 | -141.76 | 3106.688 | 3113.915 |
| 87.83004834510972 | 145.945 | -141.646 | 3100.182 | 3107.391 |
| 87.99739680178506 | 145.062 | -141.253 | 3093.054 | 3100.198 |
| 88.1647452584604 | 143.542 | -140.485 | 3084.83 | 3091.876 |
| 88.33209371513574 | 141.498 | -139.242 | 3074.955 | 3081.855 |
| 88.49944217181108 | 139.128 | -137.706 | 3063.233 | 3069.953 |
| 88.66679062848644 | 136.545 | -136.038 | 3049.599 | 3056.154 |
| 88.83413908516178 | 133.847 | -134.305 | 3034.116 | 3040.476 |
| 89.00148754183712 | 131.166 | -132.654 | 3017.032 | 3023.244 |
| 89.16883599851246 | 128.583 | -131.15 | 2998.623 | 3004.689 |
| 89.33618445518782 | 126.131 | -129.793 | 2979.054 | 2984.972 |
| 89.50353291186315 | 123.809 | -128.681 | 2958.536 | 2964.356 |
| 89.6708813685385 | 121.537 | -127.749 | 2937.266 | 2942.988 |
| 89.83822982521386 | 119.166 | -126.932 | 2915.506 | 2921.13 |
| 90.00557828188919 | 116.534 | -125.918 | 2893.419 | 2898.945 |
| 90.16362960208257 | 113.558 | -124.757 | 2870.661 | 2876.057 |
| 90.3309780587579 | 110.24 | -123.417 | 2846.743 | 2852.008 |
| 90.49832651543326 | 106.676 | -121.929 | 2820.847 | 2825.964 |
| 90.66567497210859 | 102.915 | -120.36 | 2792.253 | 2797.239 |
| 90.83302342878395 | 98.943 | -118.708 | 2760.88 | 2765.735 |
| 91.00037188545929 | 94.757 | -117.008 | 2726.825 | 2731.55 |
| 91.16772034213463 | 90.36 | -115.275 | 2690.073 | 2694.7 |
| 91.33506879880998 | 85.749 | -113.428 | 2650.575 | 2655.07 |
| 91.50241725548533 | 80.943 | -111.319 | 2607.937 | 2612.318 |
| 91.66976571216065 | 75.989 | -108.997 | 2562.275 | 2566.526 |
| 91.83711416883601 | 70.937 | -106.414 | 2513.539 | 2517.659 |
| 92.00446262551137 | 65.771 | -103.471 | 2461.648 | 2465.637 |
| 92.1718110821867 | 60.556 | -100.152 | 2406.618 | 2410.46 |
| 92.33915953886203 | 55.308 | -96.474 | 2348.956 | 2352.635 |
| 92.49721085905541 | 50.109 | -92.469 | 2289.136 | 2292.668 |
| 92.66455931573077 | 45.008 | -88.152 | 2227.485 | 2230.853 |
| 92.83190777240611 | 40.12 | -83.689 | 2164.82 | 2168.041 |
| 92.99925622908145 | 35.493 | -79.242 | 2102.008 | 2105.066 |
| 93.1666046857568 | 31.193 | -74.926 | 2039.916 | 2042.826 |
| 93.33395314243214 | 27.253 | -70.806 | 1979.393 | 1982.156 |
| 93.50130159910749 | 23.689 | -66.866 | 1920.864 | 1923.48 |
| 93.66865005578283 | 20.452 | -62.959 | 1864.477 | 1866.962 |
| 93.83599851245818 | 17.575 | -59.117 | 1810.87 | 1813.208 |
| 94.00334696913353 | 15.074 | -55.406 | 1760.205 | 1762.412 |
| 94.17069542580886 | 12.948 | -51.809 | 1712.745 | 1714.805 |
| 94.3380438824842 | 11.199 | -48.343 | 1668.407 | 1670.336 |
| 94.50539233915954 | 9.793 | -45.09 | 1627.78 | 1629.578 |
| 94.66344365935292 | 8.698 | -42.016 | 1590.865 | 1592.549 |
| 94.83079211602828 | 7.847 | -39.139 | 1557.546 | 1559.115 |
| 94.99814057270362 | 7.242 | -36.539 | 1527.938 | 1529.41 |
| 95.16548902937897 | 6.834 | -34.136 | 1502.14 | 1503.513 |
| 95.33283748605432 | 6.621 | -31.945 | 1480.543 | 1481.851 |
| 95.50018594272963 | 6.556 | -30 | 1463.573 | 1464.799 |
| 95.66753439940499 | 6.638 | -28.349 | 1451.214 | 1452.374 |
| 95.83488285608034 | 6.866 | -26.959 | 1443.268 | 1444.38 |
| 96.00223131275567 | 7.21 | -25.831 | 1439.475 | 1440.538 |
| 96.16957976943102 | 7.619 | -24.965 | 1439.541 | 1440.571 |
| 96.33692822610638 | 8.109 | -24.311 | 1442.761 | 1443.775 |
| 96.50427668278171 | 8.632 | -23.853 | 1448.516 | 1449.497 |
| 96.67162513945706 | 9.221 | -23.64 | 1456.265 | 1457.246 |
| 96.8389735961324 | 9.907 | -23.755 | 1466.287 | 1467.252 |
| 96.99702491632577 | 10.807 | -24.229 | 1479.431 | 1480.396 |
| 97.16437337300111 | 11.902 | -25.046 | 1495.862 | 1496.827 |
| 97.33172182967647 | 13.21 | -26.207 | 1515.726 | 1516.69 |
| 97.49907028635181 | 14.73 | -27.695 | 1539.023 | 1540.02 |
| 97.66641874302715 | 16.48 | -29.526 | 1565.737 | 1566.767 |
| 97.8337671997025 | 18.441 | -31.668 | 1595.753 | 1596.816 |
| 98.00111565637785 | 20.616 | -34.12 | 1629.121 | 1630.232 |
| 98.16846411305319 | 23.003 | -36.85 | 1665.48 | 1666.657 |
| 98.33581256972855 | 25.651 | -39.793 | 1705.142 | 1706.401 |
| 98.50316102640389 | 28.48 | -42.965 | 1747.616 | 1748.973 |
| 98.67050948307921 | 31.422 | -46.283 | 1791.954 | 1793.426 |
| 98.83785793975456 | 34.43 | -49.7 | 1837.126 | 1838.712 |
| 99.0052063964299 | 37.373 | -53.052 | 1880.941 | 1882.641 |
| 99.17255485310525 | 40.087 | -56.174 | 1921.028 | 1922.842 |
| 99.33060617329863 | 42.507 | -58.986 | 1956.161 | 1958.074 |
| 99.49795462997399 | 44.616 | -61.406 | 1985.867 | 1987.861 |
| 99.66530308664933 | 46.365 | -63.4 | 2009.622 | 2011.698 |
| 99.83265154332467 | 47.575 | -64.823 | 2026.346 | 2028.472 |
| 100.0 | 48.229 | -65.624 | 2035.453 | 2037.611 |